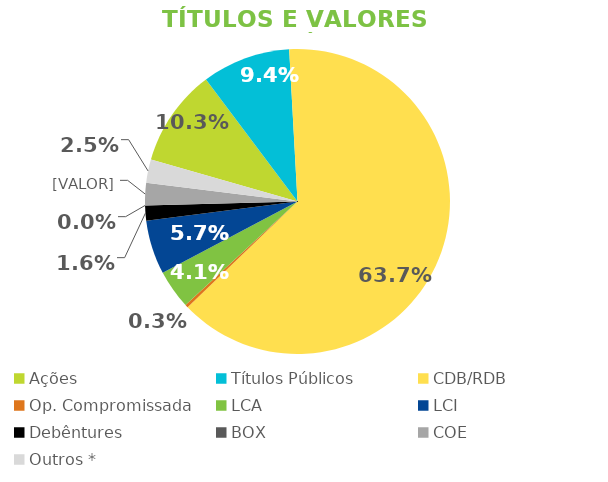
| Category | TVM |
|---|---|
| Ações | 0.103 |
| Títulos Públicos | 0.094 |
| CDB/RDB | 0.637 |
| Op. Compromissada | 0.003 |
| LCA | 0.041 |
| LCI | 0.057 |
| Debêntures | 0.016 |
| BOX | 0 |
| COE | 0.024 |
| Outros * | 0.025 |